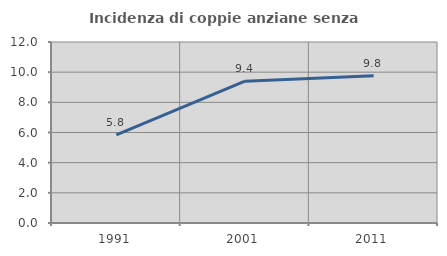
| Category | Incidenza di coppie anziane senza figli  |
|---|---|
| 1991.0 | 5.835 |
| 2001.0 | 9.402 |
| 2011.0 | 9.762 |